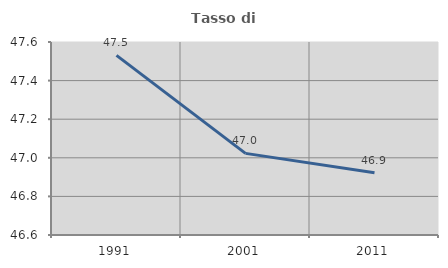
| Category | Tasso di occupazione   |
|---|---|
| 1991.0 | 47.531 |
| 2001.0 | 47.023 |
| 2011.0 | 46.923 |